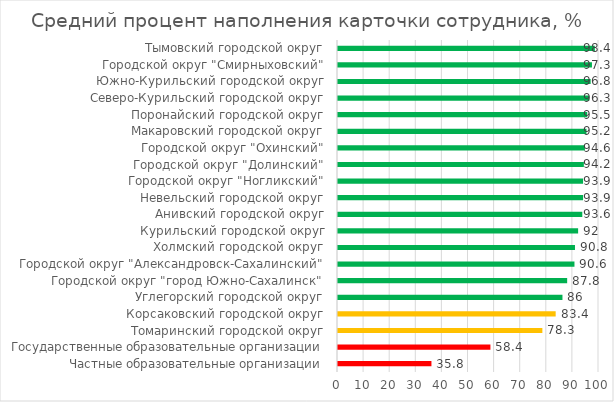
| Category | Средний процент наполнения карточки сотрудника, % |
|---|---|
| Частные образовательные организации | 35.8 |
| Государственные образовательные организации | 58.4 |
| Томаринский городской округ | 78.3 |
| Корсаковский городской округ | 83.4 |
| Углегорский городской округ | 86 |
| Городской округ "город Южно-Сахалинск" | 87.8 |
| Городской округ "Александровск-Сахалинский" | 90.6 |
| Холмский городской округ | 90.8 |
| Курильский городской округ | 92 |
| Анивский городской округ | 93.6 |
| Невельский городской округ | 93.9 |
| Городской округ "Ногликский" | 93.9 |
| Городской округ "Долинский" | 94.2 |
| Городской округ "Охинский" | 94.6 |
| Макаровский городской округ | 95.2 |
| Поронайский городской округ | 95.5 |
| Северо-Курильский городской округ | 96.3 |
| Южно-Курильский городской округ | 96.8 |
| Городской округ "Смирныховский" | 97.3 |
| Тымовский городской округ | 98.4 |